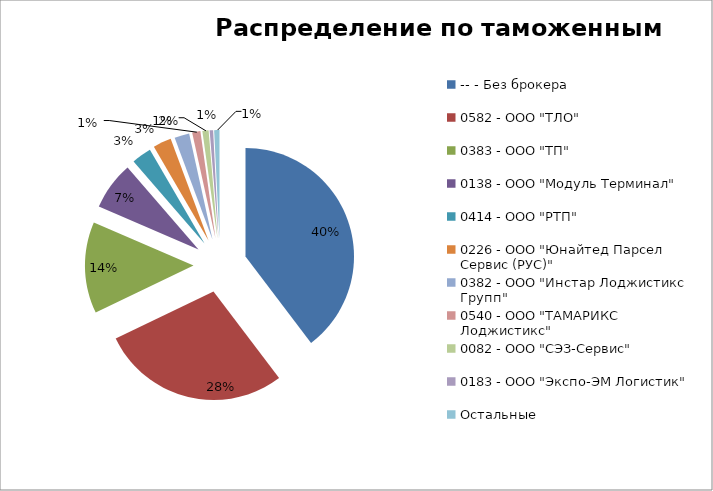
| Category | Стоимость, USD |
|---|---|
| -- - Без брокера | 3942367.43 |
| 0582 - ООО "ТЛО" | 2802336.1 |
| 0383 - ООО "ТП" | 1351557.1 |
| 0138 - ООО "Модуль Терминал" | 714367.5 |
| 0414 - ООО "РТП" | 292875 |
| 0226 - ООО "Юнайтед Парсел Сервис (РУС)" | 270850 |
| 0382 - ООО "Инстар Лоджистикс Групп" | 219956.04 |
| 0540 - ООО "ТАМАРИКС Лоджистикс" | 121674.15 |
| 0082 - ООО "СЭЗ-Сервис" | 91899.81 |
| 0183 - ООО "Экспо-ЭМ Логистик" | 51539.91 |
| Остальные | 78383.61 |